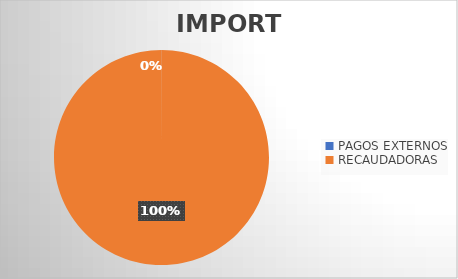
| Category | IMPORTE |
|---|---|
| PAGOS EXTERNOS | 469291.28 |
| RECAUDADORAS | 1640156605.95 |